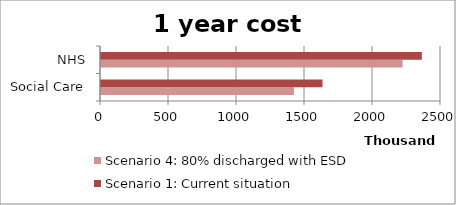
| Category | Scenario 4: 80% discharged with ESD | Scenario 1: Current situation |
|---|---|---|
| 0 | 1418696.68 | 1628776.504 |
| 1 | 2217531.4 | 2359264.81 |